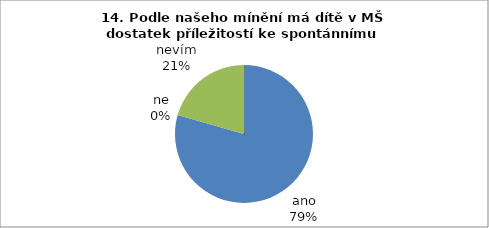
| Category | 14. |
|---|---|
| ano | 27 |
| ne | 0 |
| nevím | 7 |